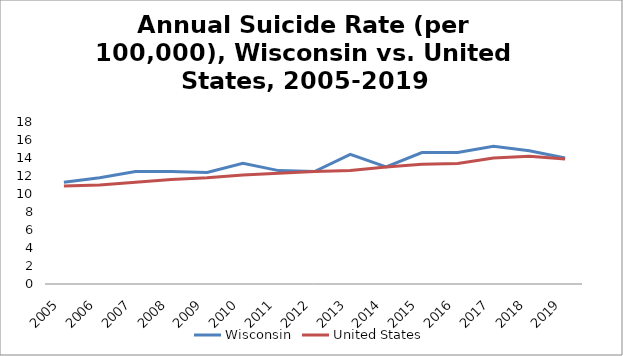
| Category | Wisconsin | United States |
|---|---|---|
| 2005.0 | 11.3 | 10.9 |
| 2006.0 | 11.8 | 11 |
| 2007.0 | 12.5 | 11.3 |
| 2008.0 | 12.5 | 11.6 |
| 2009.0 | 12.4 | 11.8 |
| 2010.0 | 13.4 | 12.1 |
| 2011.0 | 12.6 | 12.3 |
| 2012.0 | 12.5 | 12.5 |
| 2013.0 | 14.4 | 12.6 |
| 2014.0 | 13 | 13 |
| 2015.0 | 14.6 | 13.3 |
| 2016.0 | 14.6 | 13.4 |
| 2017.0 | 15.3 | 14 |
| 2018.0 | 14.8 | 14.2 |
| 2019.0 | 14 | 13.9 |